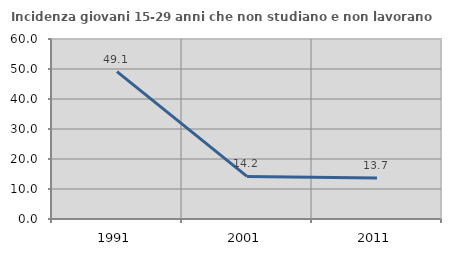
| Category | Incidenza giovani 15-29 anni che non studiano e non lavorano  |
|---|---|
| 1991.0 | 49.11 |
| 2001.0 | 14.198 |
| 2011.0 | 13.665 |